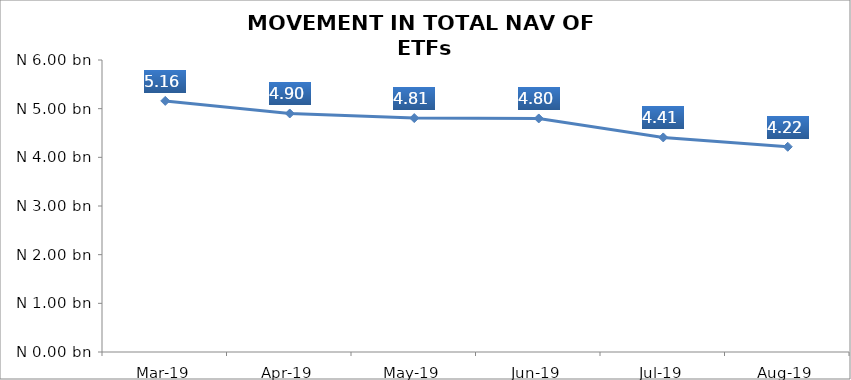
| Category | Series 0 |
|---|---|
| 2019-03-01 | 5159546061.43 |
| 2019-04-01 | 4900686319.26 |
| 2019-05-01 | 4806926836.41 |
| 2019-06-01 | 4798796600.8 |
| 2019-07-01 | 4409094037.91 |
| 2019-08-01 | 4217039446.38 |